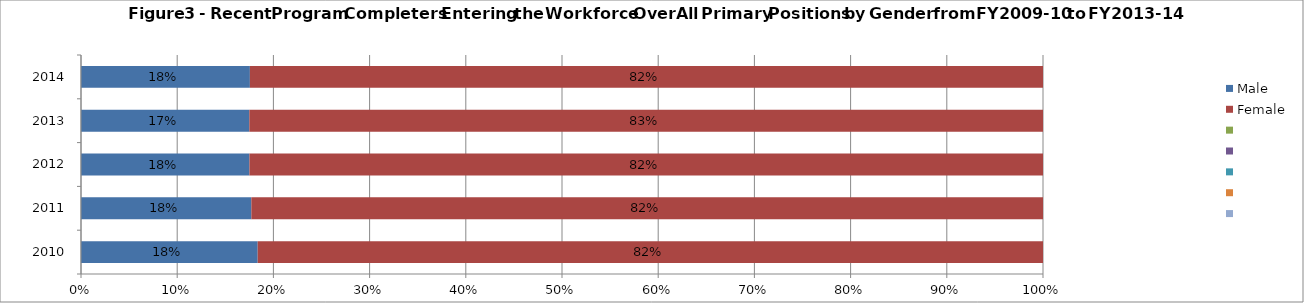
| Category | Male | Female | Series 2 | Series 3 | Series 4 | Series 5 | Series 6 |
|---|---|---|---|---|---|---|---|
| 2010.0 | 0.184 | 0.816 | 0 | 0 | 0 | 0 | 0 |
| 2011.0 | 0.177 | 0.823 | 0 | 0 | 0 | 0 | 0 |
| 2012.0 | 0.175 | 0.825 | 0 | 0 | 0 | 0 | 0 |
| 2013.0 | 0.175 | 0.825 | 0 | 0 | 0 | 0 | 0 |
| 2014.0 | 0.176 | 0.824 | 0 | 0 | 0 | 0 | 0 |